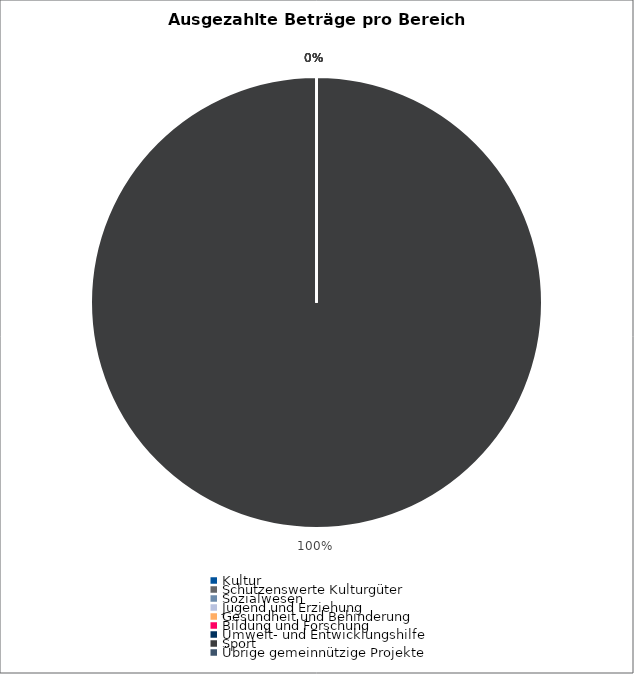
| Category | Series 0 |
|---|---|
| Kultur | 0 |
| Schützenswerte Kulturgüter | 0 |
| Sozialwesen | 0 |
| Jugend und Erziehung | 0 |
| Gesundheit und Behinderung | 0 |
| Bildung und Forschung | 0 |
| Umwelt- und Entwicklungshilfe | 0 |
| Sport | 2483587 |
| Übrige gemeinnützige Projekte | 0 |